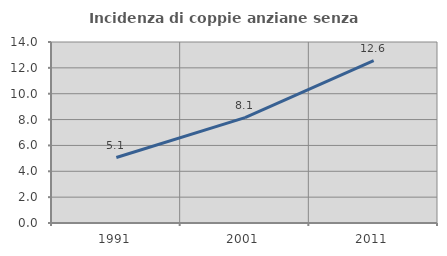
| Category | Incidenza di coppie anziane senza figli  |
|---|---|
| 1991.0 | 5.066 |
| 2001.0 | 8.147 |
| 2011.0 | 12.558 |